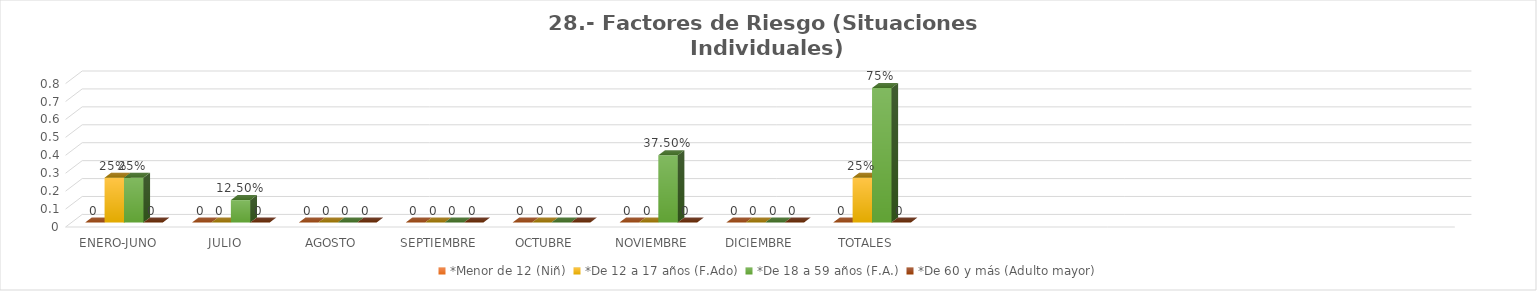
| Category | *Menor de 12 (Niñ) | *De 12 a 17 años (F.Ado) | *De 18 a 59 años (F.A.) | *De 60 y más (Adulto mayor) |
|---|---|---|---|---|
| ENERO-JUNO | 0 | 0.25 | 0.25 | 0 |
| JULIO | 0 | 0 | 0.125 | 0 |
| AGOSTO | 0 | 0 | 0 | 0 |
| SEPTIEMBRE | 0 | 0 | 0 | 0 |
| OCTUBRE | 0 | 0 | 0 | 0 |
| NOVIEMBRE | 0 | 0 | 0.375 | 0 |
| DICIEMBRE | 0 | 0 | 0 | 0 |
| TOTALES | 0 | 0.25 | 0.75 | 0 |